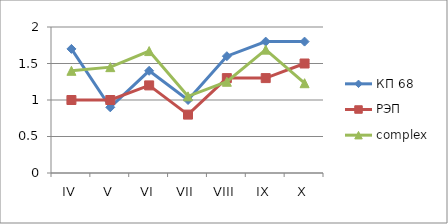
| Category | КП 68 | РЭП  | complex |
|---|---|---|---|
| IV | 1.7 | 1 | 1.4 |
| V | 0.9 | 1 | 1.45 |
| VI | 1.4 | 1.2 | 1.67 |
| VII | 1 | 0.8 | 1.05 |
| VIII | 1.6 | 1.3 | 1.25 |
| IX | 1.8 | 1.3 | 1.69 |
| X | 1.8 | 1.5 | 1.23 |